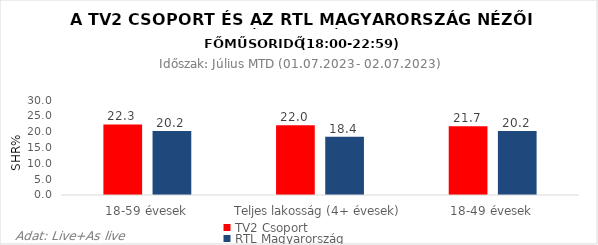
| Category | TV2 Csoport | RTL Magyarország |
|---|---|---|
| 18-59 évesek | 22.3 | 20.2 |
| Teljes lakosság (4+ évesek) | 22 | 18.4 |
| 18-49 évesek | 21.7 | 20.2 |